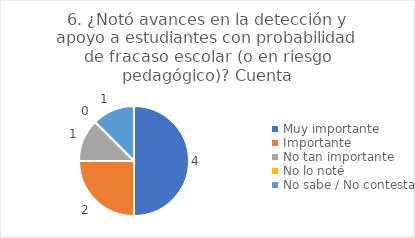
| Category | 6. ¿Notó avances en la detección y apoyo a estudiantes con probabilidad de fracaso escolar (o en riesgo pedagógico)? |
|---|---|
| Muy importante  | 0.5 |
| Importante  | 0.25 |
| No tan importante  | 0.125 |
| No lo noté  | 0 |
| No sabe / No contesta | 0.125 |